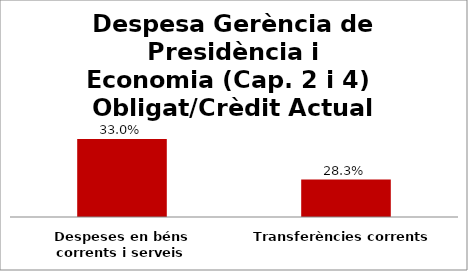
| Category | Series 0 |
|---|---|
| Despeses en béns corrents i serveis | 0.33 |
| Transferències corrents | 0.283 |